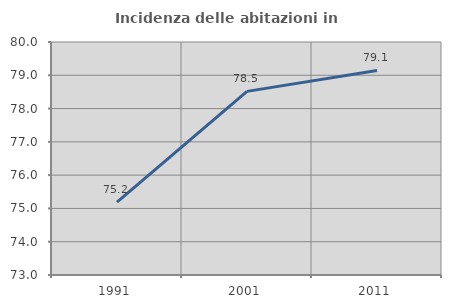
| Category | Incidenza delle abitazioni in proprietà  |
|---|---|
| 1991.0 | 75.187 |
| 2001.0 | 78.516 |
| 2011.0 | 79.147 |